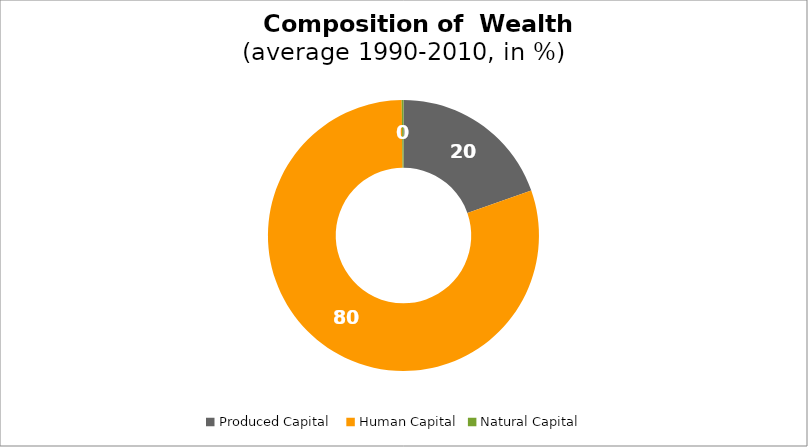
| Category | Series 0 |
|---|---|
| Produced Capital  | 19.597 |
| Human Capital | 80.188 |
| Natural Capital | 0.215 |